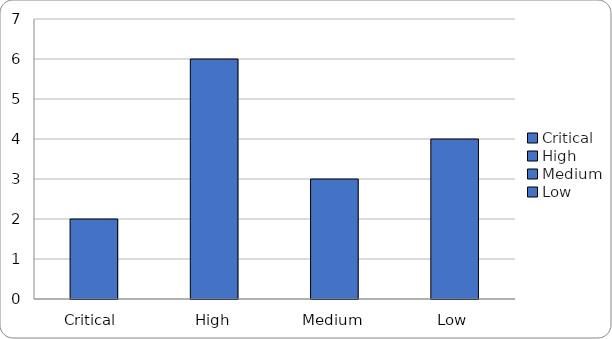
| Category | Series 0 |
|---|---|
| Critical  | 2 |
| High | 6 |
| Medium | 3 |
| Low | 4 |